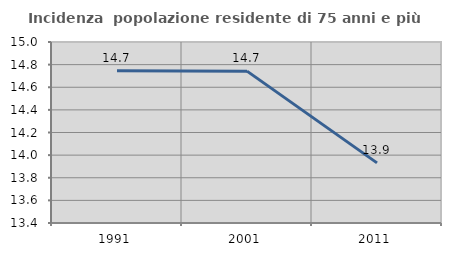
| Category | Incidenza  popolazione residente di 75 anni e più |
|---|---|
| 1991.0 | 14.747 |
| 2001.0 | 14.742 |
| 2011.0 | 13.931 |